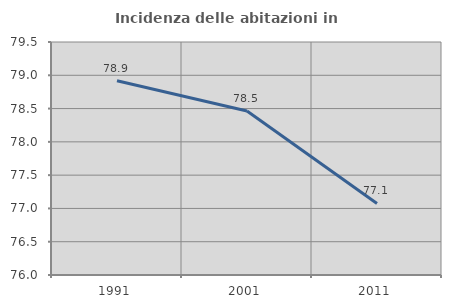
| Category | Incidenza delle abitazioni in proprietà  |
|---|---|
| 1991.0 | 78.917 |
| 2001.0 | 78.464 |
| 2011.0 | 77.075 |